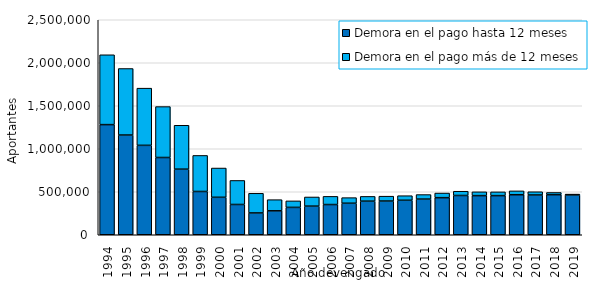
| Category | Demora en el pago hasta 12 meses | Demora en el pago más de 12 meses |
|---|---|---|
| 1994.0 | 1280531 | 812197 |
| 1995.0 | 1159572 | 773490 |
| 1996.0 | 1039623 | 665056 |
| 1997.0 | 898296 | 592164 |
| 1998.0 | 762590 | 510592 |
| 1999.0 | 503096 | 419249 |
| 2000.0 | 435683 | 340213 |
| 2001.0 | 352103 | 279416 |
| 2002.0 | 253774 | 228296 |
| 2003.0 | 278378 | 129587 |
| 2004.0 | 318205 | 75636 |
| 2005.0 | 332823 | 106426 |
| 2006.0 | 351352 | 94955 |
| 2007.0 | 366614 | 65014 |
| 2008.0 | 390567 | 55464 |
| 2009.0 | 392023 | 56614 |
| 2010.0 | 401149 | 53065 |
| 2011.0 | 414692 | 52617 |
| 2012.0 | 431245 | 53781 |
| 2013.0 | 456751 | 49300 |
| 2014.0 | 455044 | 44050 |
| 2015.0 | 454949 | 43686 |
| 2016.0 | 465352 | 44782 |
| 2017.0 | 462505 | 37599 |
| 2018.0 | 465921 | 25697 |
| 2019.0 | 462902 | 9881 |